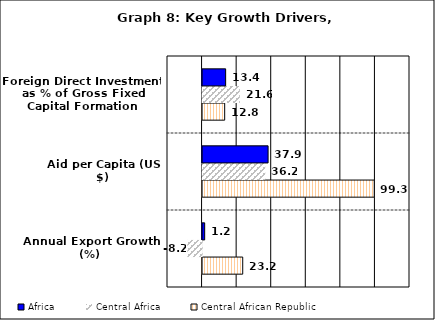
| Category | Central African Republic | Central Africa | Africa |
|---|---|---|---|
| Annual Export Growth (%) | 23.233 | -8.24 | 1.219 |
| Aid per Capita (US $) | 99.327 | 36.237 | 37.904 |
| Foreign Direct Investment as % of Gross Fixed Capital Formation | 12.792 | 21.581 | 13.354 |